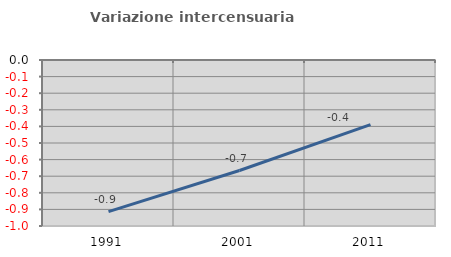
| Category | Variazione intercensuaria annua |
|---|---|
| 1991.0 | -0.913 |
| 2001.0 | -0.666 |
| 2011.0 | -0.39 |